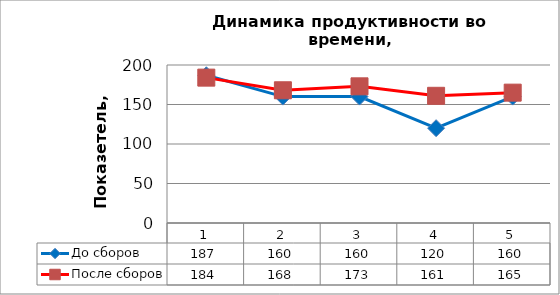
| Category | До сборов | После сборов |
|---|---|---|
| 0 | 187 | 184 |
| 1 | 160 | 168 |
| 2 | 160 | 173 |
| 3 | 120 | 161 |
| 4 | 160 | 165 |